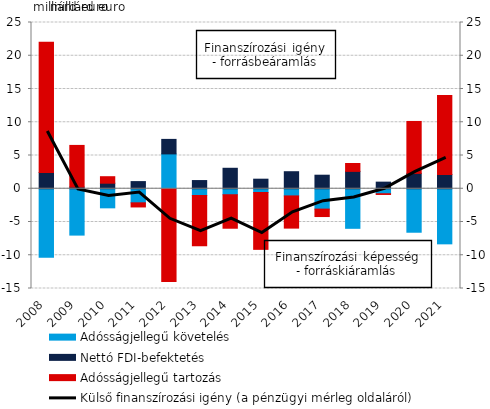
| Category | Adósságjellegű követelés | Nettó FDI-befektetés | Adósságjellegű tartozás |
|---|---|---|---|
| 2008.0 | -10.309 | 2.445 | 19.587 |
| 2009.0 | -6.97 | 0.259 | 6.258 |
| 2010.0 | -2.87 | 0.835 | 0.976 |
| 2011.0 | -2.116 | 1.076 | -0.621 |
| 2012.0 | 5.24 | 2.183 | -13.932 |
| 2013.0 | -1.033 | 1.232 | -7.528 |
| 2014.0 | -0.901 | 3.078 | -5.035 |
| 2015.0 | -0.567 | 1.438 | -8.546 |
| 2016.0 | -1.078 | 2.563 | -4.841 |
| 2017.0 | -3.061 | 2.037 | -1.118 |
| 2018.0 | -5.949 | 2.612 | 1.187 |
| 2019.0 | -0.752 | 0.994 | -0.108 |
| 2020.0 | -6.539 | 2.311 | 7.809 |
| 2021.0 | -8.285 | 2.143 | 11.885 |